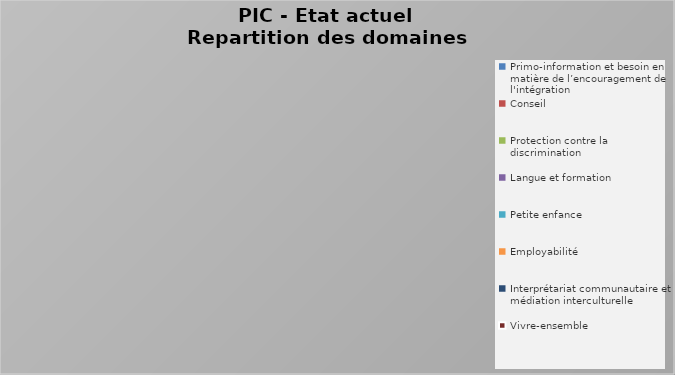
| Category | Total |
|---|---|
| Primo-information et besoin en matière de l’encouragement de l'intégration | 0 |
| Conseil | 0 |
| Protection contre la discrimination | 0 |
| Langue et formation | 0 |
| Petite enfance | 0 |
| Employabilité | 0 |
| Interprétariat communautaire et médiation interculturelle | 0 |
| Vivre-ensemble | 0 |